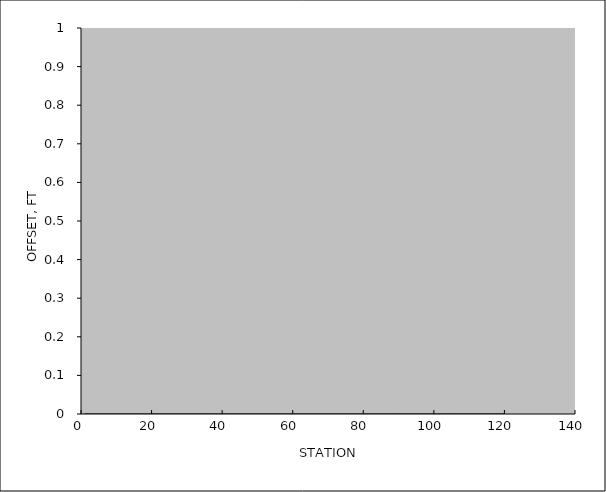
| Category | Series 0 |
|---|---|
| 0.0 | 0 |
| 0.0 | 0 |
| 0.0 | 0 |
| 0.0 | 0 |
| 0.0 | 0 |
| 0.0 | 0 |
| 0.0 | 0 |
| 0.0 | 0 |
| 0.0 | 0 |
| 0.0 | 0 |
| 0.0 | 0 |
| 0.0 | 0 |
| 0.0 | 0 |
| 0.0 | 0 |
| 0.0 | 0 |
| 0.0 | 0 |
| 0.0 | 0 |
| 0.0 | 0 |
| 0.0 | 0 |
| 0.0 | 0 |
| 0.0 | 0 |
| 0.0 | 0 |
| 0.0 | 0 |
| 0.0 | 0 |
| 0.0 | 0 |
| 0.0 | 0 |
| 0.0 | 0 |
| 0.0 | 0 |
| 0.0 | 0 |
| 0.0 | 0 |
| 0.0 | 0 |
| 0.0 | 0 |
| 0.0 | 0 |
| 0.0 | 0 |
| 0.0 | 0 |
| 0.0 | 0 |
| 0.0 | 0 |
| 0.0 | 0 |
| 0.0 | 0 |
| 0.0 | 0 |
| 0.0 | 0 |
| 0.0 | 0 |
| 0.0 | 0 |
| 0.0 | 0 |
| 0.0 | 0 |
| 0.0 | 0 |
| 0.0 | 0 |
| 0.0 | 0 |
| 0.0 | 0 |
| 0.0 | 0 |
| 0.0 | 0 |
| 0.0 | 0 |
| 0.0 | 0 |
| 0.0 | 0 |
| 0.0 | 0 |
| 0.0 | 0 |
| 0.0 | 0 |
| 0.0 | 0 |
| 0.0 | 0 |
| 0.0 | 0 |
| 0.0 | 0 |
| 0.0 | 0 |
| 0.0 | 0 |
| 0.0 | 0 |
| 0.0 | 0 |
| 0.0 | 0 |
| 0.0 | 0 |
| 0.0 | 0 |
| 0.0 | 0 |
| 0.0 | 0 |
| 0.0 | 0 |
| 0.0 | 0 |
| 0.0 | 0 |
| 0.0 | 0 |
| 0.0 | 0 |
| 0.0 | 0 |
| 0.0 | 0 |
| 0.0 | 0 |
| 0.0 | 0 |
| 0.0 | 0 |
| 0.0 | 0 |
| 0.0 | 0 |
| 0.0 | 0 |
| 0.0 | 0 |
| 0.0 | 0 |
| 0.0 | 0 |
| 0.0 | 0 |
| 0.0 | 0 |
| 0.0 | 0 |
| 0.0 | 0 |
| 0.0 | 0 |
| 0.0 | 0 |
| 0.0 | 0 |
| 0.0 | 0 |
| 0.0 | 0 |
| 0.0 | 0 |
| 0.0 | 0 |
| 0.0 | 0 |
| 0.0 | 0 |
| 0.0 | 0 |
| 0.0 | 0 |
| 0.0 | 0 |
| 0.0 | 0 |
| 0.0 | 0 |
| 0.0 | 0 |
| 0.0 | 0 |
| 0.0 | 0 |
| 0.0 | 0 |
| 0.0 | 0 |
| 0.0 | 0 |
| 0.0 | 0 |
| 0.0 | 0 |
| 0.0 | 0 |
| 0.0 | 0 |
| 0.0 | 0 |
| 0.0 | 0 |
| 0.0 | 0 |
| 0.0 | 0 |
| 0.0 | 0 |
| 0.0 | 0 |